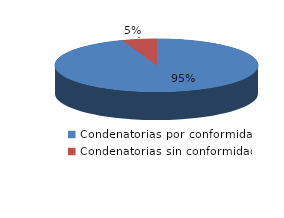
| Category | Series 0 |
|---|---|
| 0 | 574 |
| 1 | 33 |